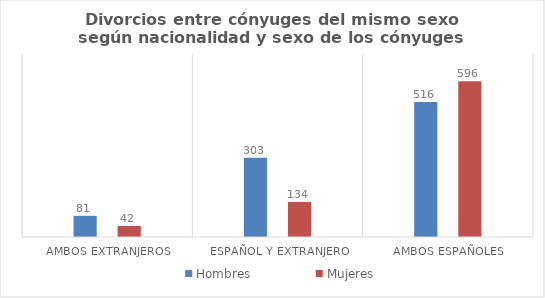
| Category | Hombres | Mujeres |
|---|---|---|
| Ambos extranjeros | 81 | 42 |
| Español y extranjero | 303 | 134 |
| Ambos españoles | 516 | 596 |